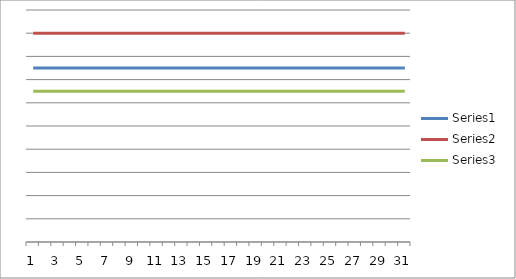
| Category | Series 0 | Series 1 | Series 2 |
|---|---|---|---|
| 0 | 150 | 180 | 130 |
| 1 | 150 | 180 | 130 |
| 2 | 150 | 180 | 130 |
| 3 | 150 | 180 | 130 |
| 4 | 150 | 180 | 130 |
| 5 | 150 | 180 | 130 |
| 6 | 150 | 180 | 130 |
| 7 | 150 | 180 | 130 |
| 8 | 150 | 180 | 130 |
| 9 | 150 | 180 | 130 |
| 10 | 150 | 180 | 130 |
| 11 | 150 | 180 | 130 |
| 12 | 150 | 180 | 130 |
| 13 | 150 | 180 | 130 |
| 14 | 150 | 180 | 130 |
| 15 | 150 | 180 | 130 |
| 16 | 150 | 180 | 130 |
| 17 | 150 | 180 | 130 |
| 18 | 150 | 180 | 130 |
| 19 | 150 | 180 | 130 |
| 20 | 150 | 180 | 130 |
| 21 | 150 | 180 | 130 |
| 22 | 150 | 180 | 130 |
| 23 | 150 | 180 | 130 |
| 24 | 150 | 180 | 130 |
| 25 | 150 | 180 | 130 |
| 26 | 150 | 180 | 130 |
| 27 | 150 | 180 | 130 |
| 28 | 150 | 180 | 130 |
| 29 | 150 | 180 | 130 |
| 30 | 150 | 180 | 130 |